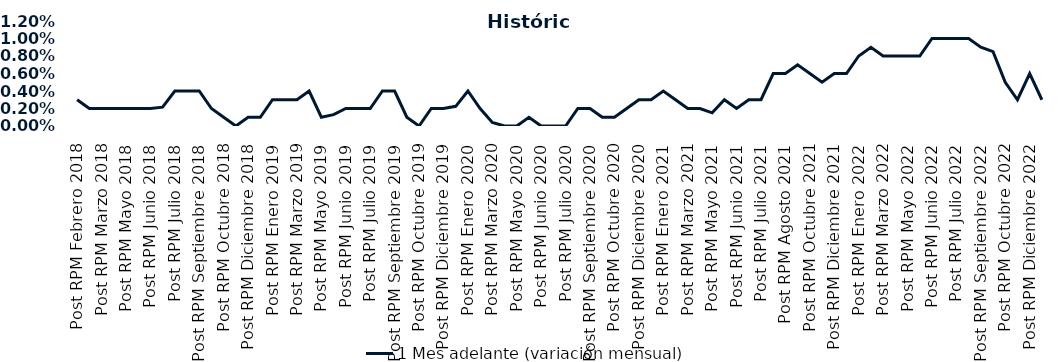
| Category | 1 Mes adelante (variación mensual) |
|---|---|
| Post RPM Febrero 2018 | 0.003 |
| Pre RPM Marzo 2018 | 0.002 |
| Post RPM Marzo 2018 | 0.002 |
| Pre RPM Mayo 2018 | 0.002 |
| Post RPM Mayo 2018 | 0.002 |
| Pre RPM Junio 2018 | 0.002 |
| Post RPM Junio 2018 | 0.002 |
| Pre RPM Julio 2018 | 0.002 |
| Post RPM Julio 2018 | 0.004 |
| Pre RPM Septiembre 2018 | 0.004 |
| Post RPM Septiembre 2018 | 0.004 |
| Pre RPM Octubre 2018 | 0.002 |
| Post RPM Octubre 2018 | 0.001 |
| Pre RPM Diciembre 2018 | 0 |
| Post RPM Diciembre 2018 | 0.001 |
| Pre RPM Enero 2019 | 0.001 |
| Post RPM Enero 2019 | 0.003 |
| Pre RPM Marzo 2019 | 0.003 |
| Post RPM Marzo 2019 | 0.003 |
| Pre RPM Mayo 2019 | 0.004 |
| Post RPM Mayo 2019 | 0.001 |
| Pre RPM Junio 2019 | 0.001 |
| Post RPM Junio 2019 | 0.002 |
| Pre RPM Julio 2019 | 0.002 |
| Post RPM Julio 2019 | 0.002 |
| Pre RPM Septiembre 2019 | 0.004 |
| Post RPM Septiembre 2019 | 0.004 |
| Pre RPM Octubre 2019 | 0.001 |
| Post RPM Octubre 2019 | 0 |
| Pre RPM Diciembre 2019 | 0.002 |
| Post RPM Diciembre 2019 | 0.002 |
| Pre RPM Enero 2020 | 0.002 |
| Post RPM Enero 2020 | 0.004 |
| Pre RPM Marzo 2020 | 0.002 |
| Post RPM Marzo 2020 | 0 |
| Pre RPM Mayo 2020 | 0 |
| Post RPM Mayo 2020 | 0 |
| Pre RPM Junio 2020 | 0.001 |
| Post RPM Junio 2020 | 0 |
| Pre RPM Julio 2020 | 0 |
| Post RPM Julio 2020 | 0 |
| Pre RPM Septiembre 2020 | 0.002 |
| Post RPM Septiembre 2020 | 0.002 |
| Pre RPM Octubre 2020 | 0.001 |
| Post RPM Octubre 2020 | 0.001 |
| Pre RPM Diciembre 2020 | 0.002 |
| Post RPM Diciembre 2020 | 0.003 |
| Pre RPM Enero 2021 | 0.003 |
| Post RPM Enero 2021 | 0.004 |
| Pre RPM Marzo 2021 | 0.003 |
| Post RPM Marzo 2021 | 0.002 |
| Pre RPM Mayo 2021 | 0.002 |
| Post RPM Mayo 2021 | 0.002 |
| Pre RPM Junio 2021 | 0.003 |
| Post RPM Junio 2021 | 0.002 |
| Pre RPM Julio 2021 | 0.003 |
| Post RPM Julio 2021 | 0.003 |
| Pre RPM Agosto 2021 | 0.006 |
| Post RPM Agosto 2021 | 0.006 |
| Pre RPM Octubre 2021 | 0.007 |
| Post RPM Octubre 2021 | 0.006 |
| Pre RPM Diciembre 2021 | 0.005 |
| Post RPM Diciembre 2021 | 0.006 |
| Pre RPM Enero 2022 | 0.006 |
| Post RPM Enero 2022 | 0.008 |
| Pre RPM Marzo 2022 | 0.009 |
| Post RPM Marzo 2022 | 0.008 |
| Pre RPM Mayo 2022 | 0.008 |
| Post RPM Mayo 2022 | 0.008 |
| Pre RPM Junio 2022 | 0.008 |
| Post RPM Junio 2022 | 0.01 |
| Pre RPM Julio 2022 | 0.01 |
| Post RPM Julio 2022 | 0.01 |
| Pre RPM Septiembre 2022 | 0.01 |
| Post RPM Septiembre 2022 | 0.009 |
| Pre RPM Octubre 2022 | 0.008 |
| Post RPM Octubre 2022 | 0.005 |
| Pre RPM Diciembre 2022 | 0.003 |
| Post RPM Diciembre 2022 | 0.006 |
| Pre RPM Enero 2023 | 0.003 |